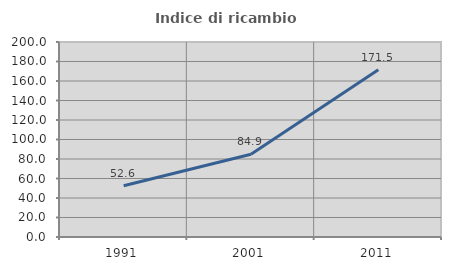
| Category | Indice di ricambio occupazionale  |
|---|---|
| 1991.0 | 52.616 |
| 2001.0 | 84.942 |
| 2011.0 | 171.515 |